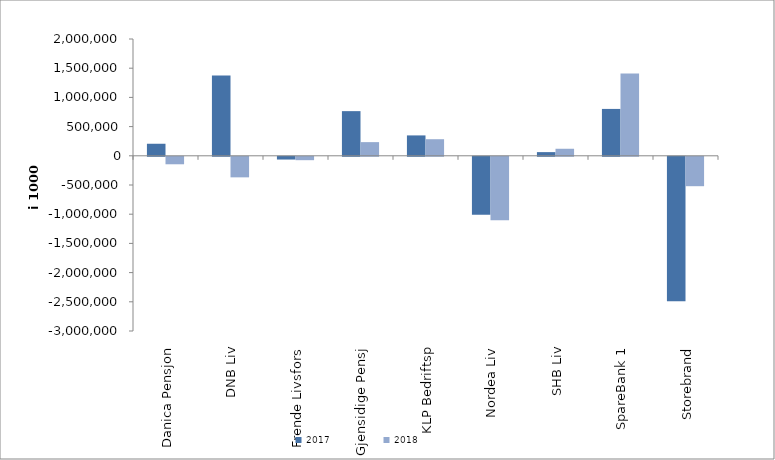
| Category | 2017 | 2018 |
|---|---|---|
| Danica Pensjon | 206271.342 | -127938.384 |
| DNB Liv | 1374998 | -351863 |
| Frende Livsfors | -46922 | -57824.5 |
| Gjensidige Pensj | 764744.393 | 234150 |
| KLP Bedriftsp | 349100 | 284074 |
| Nordea Liv | -993310.38 | -1085791.441 |
| SHB Liv | 63074 | 120585 |
| SpareBank 1 | 802761.499 | 1410787.064 |
| Storebrand | -2471418.961 | -503303.253 |